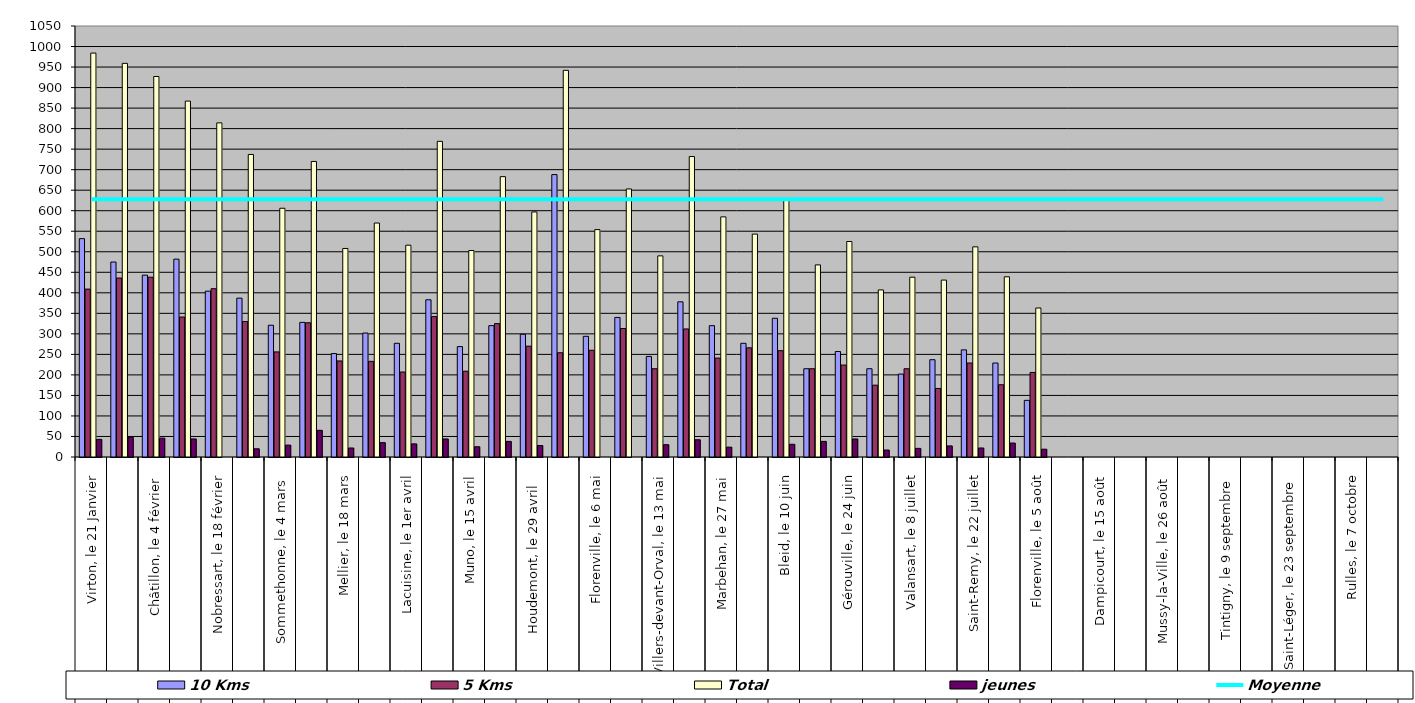
| Category | 10 Kms | 5 Kms | Total | jeunes |
|---|---|---|---|---|
| 0 | 532 | 409 | 984 | 43 |
| 1 | 475 | 436 | 959 | 48 |
| 2 | 443 | 438 | 927 | 46 |
| 3 | 482 | 341 | 867 | 44 |
| 4 | 404 | 410 | 814 | 0 |
| 5 | 387 | 330 | 737 | 20 |
| 6 | 321 | 256 | 606 | 29 |
| 7 | 328 | 327 | 720 | 65 |
| 8 | 252 | 234 | 508 | 22 |
| 9 | 302 | 233 | 570 | 35 |
| 10 | 277 | 207 | 516 | 32 |
| 11 | 383 | 342 | 769 | 44 |
| 12 | 269 | 209 | 503 | 25 |
| 13 | 320 | 325 | 683 | 38 |
| 14 | 299 | 270 | 597 | 28 |
| 15 | 688 | 254 | 942 | 0 |
| 16 | 294 | 260 | 554 | 0 |
| 17 | 340 | 313 | 653 | 0 |
| 18 | 245 | 215 | 490 | 30 |
| 19 | 378 | 312 | 732 | 42 |
| 20 | 320 | 241 | 585 | 24 |
| 21 | 277 | 266 | 543 | 0 |
| 22 | 338 | 259 | 628 | 31 |
| 23 | 215 | 215 | 468 | 38 |
| 24 | 257 | 224 | 525 | 44 |
| 25 | 215 | 175 | 407 | 17 |
| 26 | 202 | 215 | 438 | 21 |
| 27 | 237 | 167 | 431 | 27 |
| 28 | 261 | 229 | 512 | 22 |
| 29 | 229 | 176 | 439 | 34 |
| 30 | 138 | 206 | 363 | 19 |
| 31 | 0 | 0 | 0 | 0 |
| 32 | 0 | 0 | 0 | 0 |
| 33 | 0 | 0 | 0 | 0 |
| 34 | 0 | 0 | 0 | 0 |
| 35 | 0 | 0 | 0 | 0 |
| 36 | 0 | 0 | 0 | 0 |
| 37 | 0 | 0 | 0 | 0 |
| 38 | 0 | 0 | 0 | 0 |
| 39 | 0 | 0 | 0 | 0 |
| 40 | 0 | 0 | 0 | 0 |
| 41 | 0 | 0 | 0 | 0 |